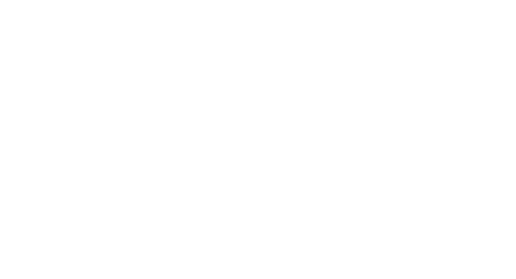
| Category | Series 0 |
|---|---|
| % Grasa: | 0 |
| % FFM: | 0 |